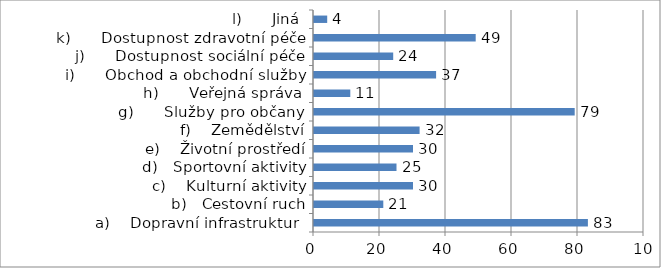
| Category | Series 0 |
|---|---|
|                  a)    Dopravní infrastruktura | 83 |
|                  b)   Cestovní ruch | 21 |
|                  c)    Kulturní aktivity | 30 |
|                  d)   Sportovní aktivity | 25 |
|                 e)    Životní prostředí | 30 |
|                  f)    Zemědělství | 32 |
|     g)      Služby pro občany | 79 |
|     h)      Veřejná správa | 11 |
|     i)      Obchod a obchodní služby | 37 |
|     j)      Dostupnost sociální péče | 24 |
|    k)      Dostupnost zdravotní péče | 49 |
|     l)      Jiná | 4 |